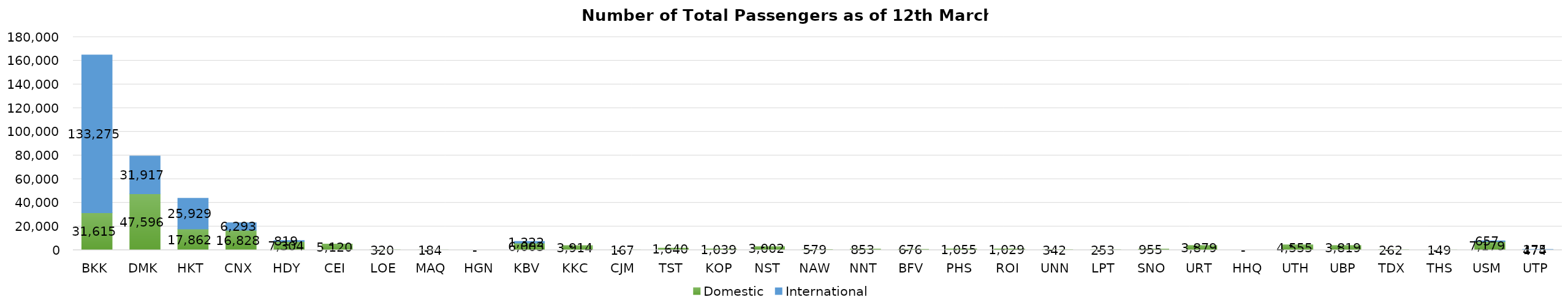
| Category | Domestic | International |
|---|---|---|
| BKK | 31615 | 133275 |
| DMK | 47596 | 31917 |
| HKT | 17862 | 25929 |
| CNX | 16828 | 6293 |
| HDY | 7304 | 819 |
| CEI | 5120 | 0 |
| LOE | 320 | 0 |
| MAQ | 184 | 0 |
| HGN | 0 | 0 |
| KBV | 6003 | 1322 |
| KKC | 3914 | 0 |
| CJM | 167 | 0 |
| TST | 1640 | 0 |
| KOP | 1039 | 0 |
| NST | 3002 | 0 |
| NAW | 579 | 0 |
| NNT | 853 | 0 |
| BFV | 676 | 0 |
| PHS | 1055 | 0 |
| ROI | 1029 | 0 |
| UNN | 342 | 0 |
| LPT | 253 | 0 |
| SNO | 955 | 0 |
| URT | 3879 | 0 |
| HHQ | 0 | 0 |
| UTH | 4555 | 0 |
| UBP | 3819 | 0 |
| TDX | 262 | 0 |
| THS | 149 | 0 |
| USM | 7179 | 657 |
| UTP | 474 | 175 |